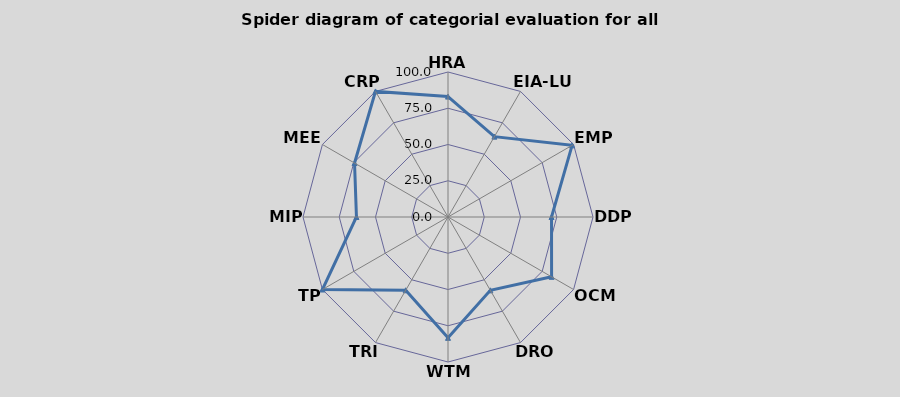
| Category | B |
|---|---|
| HRA | 83.036 |
| EIA-LUP | 64 |
| EMP | 98.828 |
| DDP | 71.397 |
| OCM | 82.5 |
| DRO | 58.393 |
| WTM | 83.333 |
| TRI | 58.333 |
| TP | 100 |
| MIP | 63.141 |
| MEE | 74.432 |
| CRP | 100 |